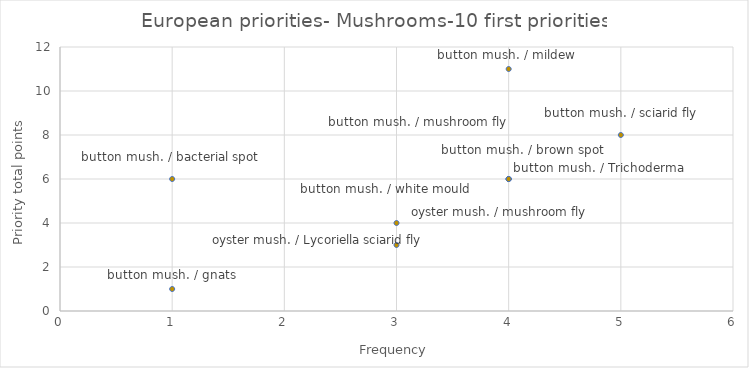
| Category | Series 0 |
|---|---|
| 4.0 | 11 |
| 5.0 | 8 |
| 1.0 | 6 |
| 4.0 | 6 |
| 4.0 | 6 |
| 4.0 | 6 |
| 4.0 | 6 |
| 3.0 | 4 |
| 3.0 | 3 |
| 1.0 | 1 |